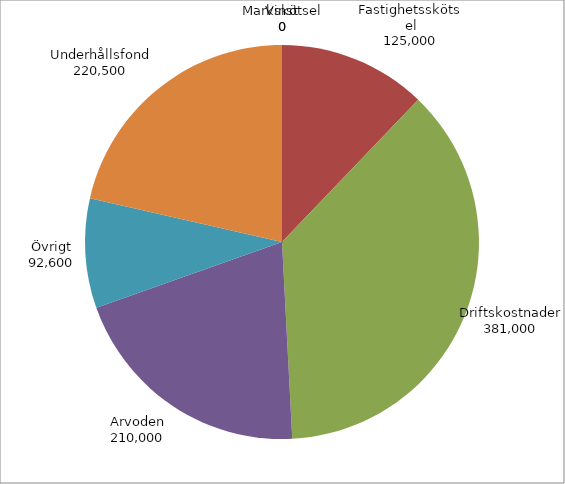
| Category | Series 0 |
|---|---|
| Markskötsel | 0 |
| Fastighetsskötsel | 125000 |
| Driftskostnader | 381000 |
| Arvoden | 210000 |
| Övrigt | 92600 |
| Underhållsfond | 220500 |
| Vinst | 0 |